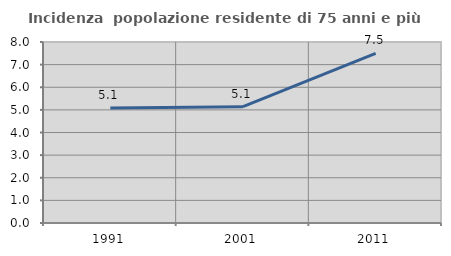
| Category | Incidenza  popolazione residente di 75 anni e più |
|---|---|
| 1991.0 | 5.078 |
| 2001.0 | 5.142 |
| 2011.0 | 7.498 |